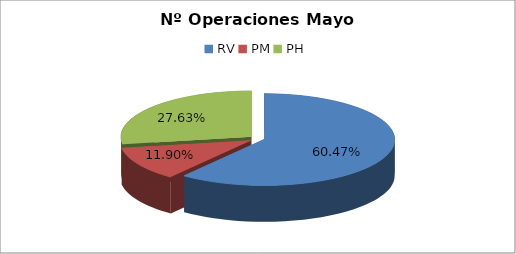
| Category | Series 0 |
|---|---|
| RV | 17431 |
| PM | 3429 |
| PH | 7965 |